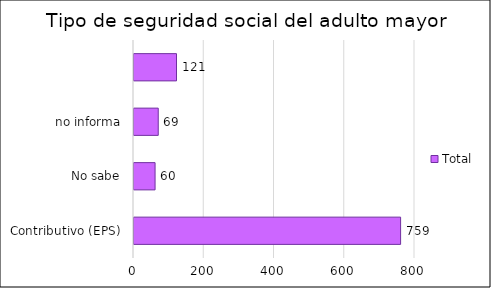
| Category | Total |
|---|---|
| Contributivo (EPS) | 759 |
| No sabe, no informa, | 60 |
| Régimen Especial (Fuerzas Armadas, Ecopetrol, Magisterio, Universidades Públicas) | 69 |
| Subsidiado (EPS) | 121 |